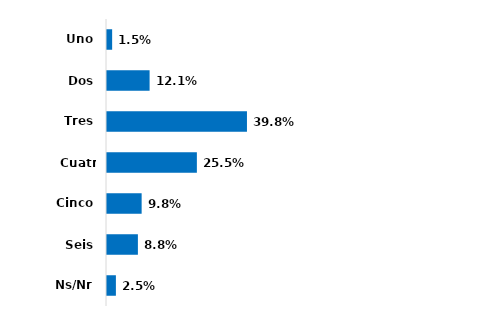
| Category | Series 0 |
|---|---|
| Uno | 0.015 |
| Dos | 0.121 |
| Tres | 0.398 |
| Cuatro | 0.255 |
| Cinco | 0.098 |
| Seis | 0.088 |
| Ns/Nr | 0.025 |